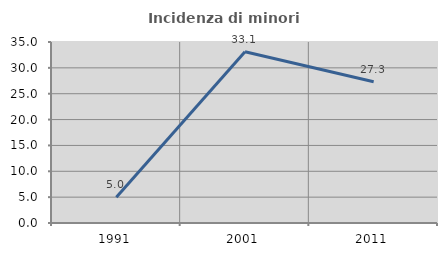
| Category | Incidenza di minori stranieri |
|---|---|
| 1991.0 | 5 |
| 2001.0 | 33.103 |
| 2011.0 | 27.302 |